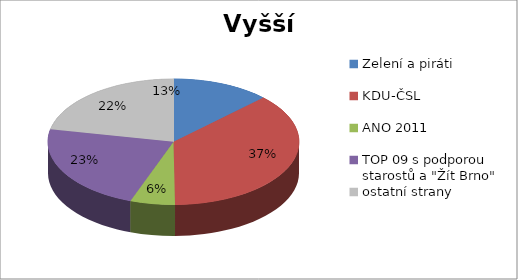
| Category | Series 0 |
|---|---|
| Zelení a piráti | 33 |
| KDU-ČSL | 97 |
| ANO 2011 | 15 |
| TOP 09 s podporou starostů a "Žít Brno" | 59 |
| ostatní strany  | 57 |